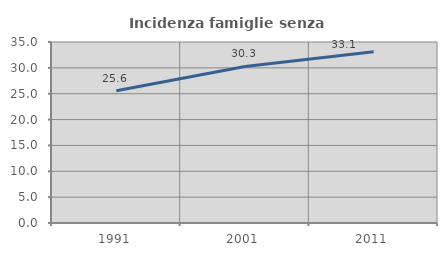
| Category | Incidenza famiglie senza nuclei |
|---|---|
| 1991.0 | 25.559 |
| 2001.0 | 30.276 |
| 2011.0 | 33.121 |